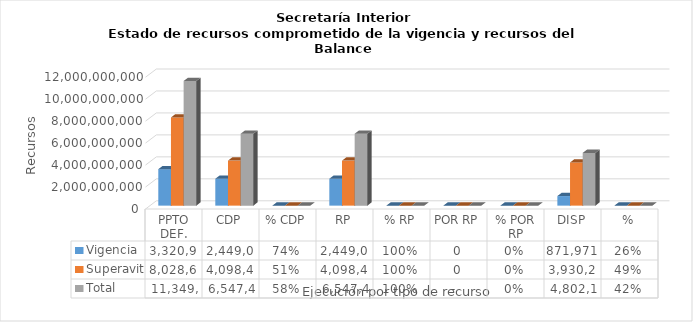
| Category | Vigencia | Superavit | Total |
|---|---|---|---|
| PPTO DEF. | 3320992979.1 | 8028631612 | 11349624591.1 |
| CDP | 2449021561 | 4098427489 | 6547449050 |
| % CDP | 0.737 | 0.51 | 0.577 |
| RP | 2449021561 | 4098427489 | 6547449050 |
| % RP | 1 | 1 | 1 |
| POR RP | 0 | 0 | 0 |
| % POR RP | 0 | 0 | 0 |
| DISP | 871971418.1 | 3930204123 | 4802175541.1 |
| % | 0.263 | 0.49 | 0.423 |